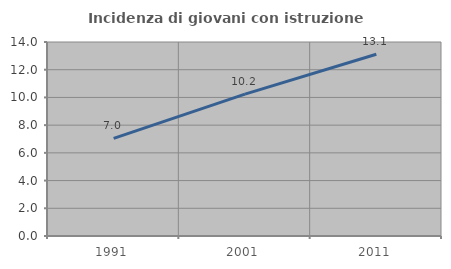
| Category | Incidenza di giovani con istruzione universitaria |
|---|---|
| 1991.0 | 7.042 |
| 2001.0 | 10.241 |
| 2011.0 | 13.115 |